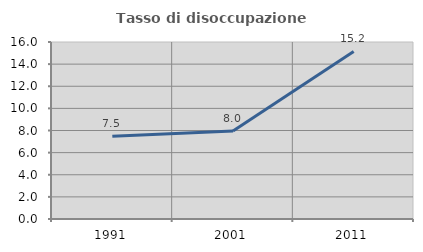
| Category | Tasso di disoccupazione giovanile  |
|---|---|
| 1991.0 | 7.483 |
| 2001.0 | 7.955 |
| 2011.0 | 15.152 |